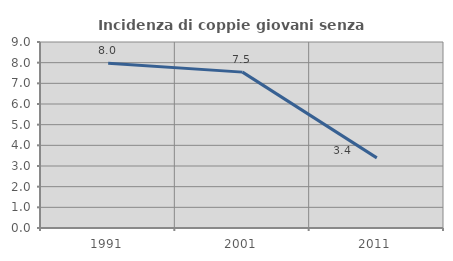
| Category | Incidenza di coppie giovani senza figli |
|---|---|
| 1991.0 | 7.976 |
| 2001.0 | 7.542 |
| 2011.0 | 3.393 |